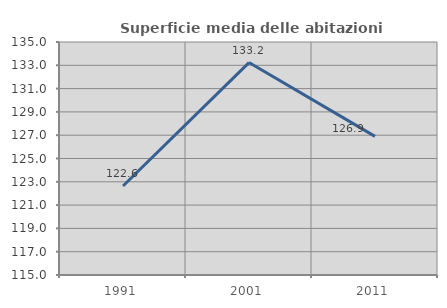
| Category | Superficie media delle abitazioni occupate |
|---|---|
| 1991.0 | 122.64 |
| 2001.0 | 133.234 |
| 2011.0 | 126.897 |